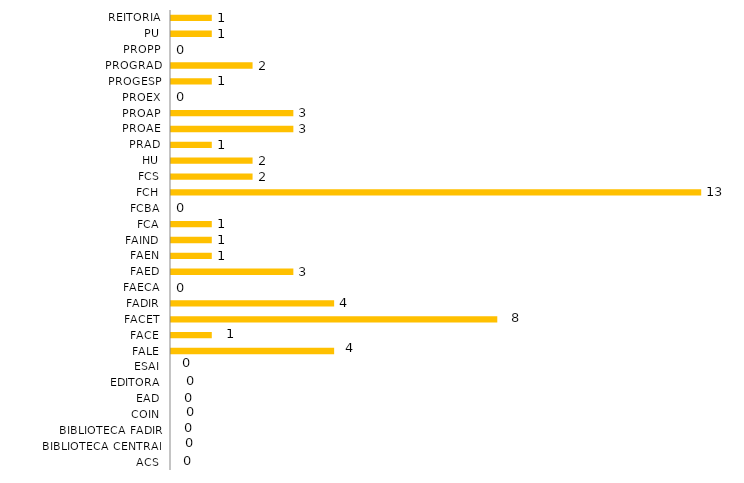
| Category | Lotação/Ano |
|---|---|
| ACS | 0 |
| BIBLIOTECA CENTRAL | 0 |
| BIBLIOTECA FADIR | 0 |
| COIN | 0 |
| EAD | 0 |
| EDITORA | 0 |
| ESAI | 0 |
| FALE | 4 |
| FACE | 1 |
| FACET | 8 |
| FADIR | 4 |
| FAECA | 0 |
| FAED | 3 |
| FAEN | 1 |
| FAIND | 1 |
| FCA | 1 |
| FCBA | 0 |
| FCH | 13 |
| FCS | 2 |
| HU | 2 |
| PRAD | 1 |
| PROAE | 3 |
| PROAP | 3 |
| PROEX | 0 |
| PROGESP | 1 |
| PROGRAD | 2 |
| PROPP | 0 |
| PU | 1 |
| REITORIA | 1 |